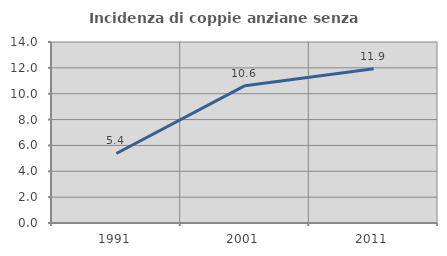
| Category | Incidenza di coppie anziane senza figli  |
|---|---|
| 1991.0 | 5.379 |
| 2001.0 | 10.624 |
| 2011.0 | 11.929 |